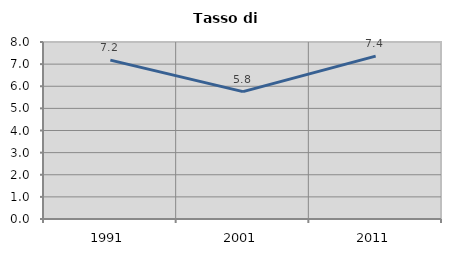
| Category | Tasso di disoccupazione   |
|---|---|
| 1991.0 | 7.181 |
| 2001.0 | 5.755 |
| 2011.0 | 7.363 |